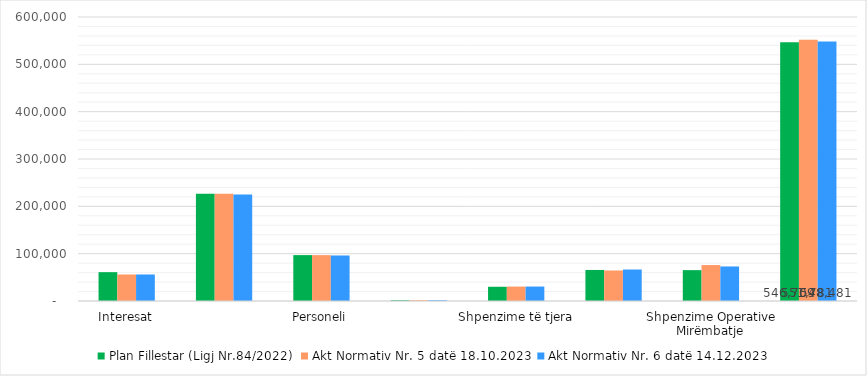
| Category | Plan Fillestar (Ligj Nr.84/2022) | Akt Normativ Nr. 5 datë 18.10.2023 | Akt Normativ Nr. 6 datë 14.12.2023 |
|---|---|---|---|
| Interesat | 60943 | 56010 | 56010 |
| Shpenzime për Fondet Speciale | 226351 | 226351 | 224751 |
| Personeli | 96978 | 96890 | 96158 |
| Subvencionet | 1600 | 1607 | 1607 |
| Shpenzime të tjera | 30050 | 30500 | 30524 |
| Shpenzime për Buxhetin Vendor | 65584 | 64473 | 66473 |
| Shpenzime Operative Mirëmbatje | 65203 | 75950 | 72958 |
| Total | 546709 | 551781 | 548481 |